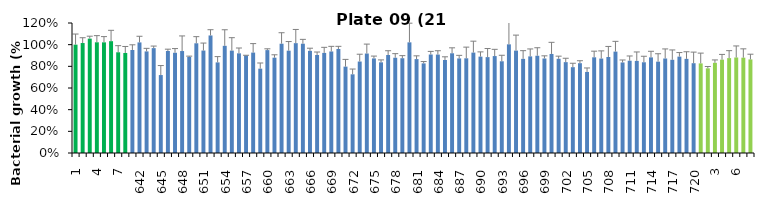
| Category | 21 h % |
|---|---|
| 1.0 | 1 |
| 2.0 | 1.015 |
| 3.0 | 1.056 |
| 4.0 | 1.022 |
| 5.0 | 1.021 |
| 6.0 | 1.032 |
| 7.0 | 0.93 |
| 8.0 | 0.923 |
| 641.0 | 0.951 |
| 642.0 | 1.021 |
| 643.0 | 0.938 |
| 644.0 | 0.968 |
| 645.0 | 0.72 |
| 646.0 | 0.942 |
| 647.0 | 0.925 |
| 648.0 | 0.941 |
| 649.0 | 0.886 |
| 650.0 | 1.013 |
| 651.0 | 0.946 |
| 652.0 | 1.085 |
| 653.0 | 0.836 |
| 654.0 | 0.989 |
| 655.0 | 0.945 |
| 656.0 | 0.92 |
| 657.0 | 0.901 |
| 658.0 | 0.927 |
| 659.0 | 0.779 |
| 660.0 | 0.95 |
| 661.0 | 0.88 |
| 662.0 | 1.009 |
| 663.0 | 0.945 |
| 664.0 | 1.014 |
| 665.0 | 1.009 |
| 666.0 | 0.943 |
| 667.0 | 0.905 |
| 668.0 | 0.924 |
| 669.0 | 0.937 |
| 670.0 | 0.96 |
| 671.0 | 0.797 |
| 672.0 | 0.726 |
| 673.0 | 0.844 |
| 674.0 | 0.918 |
| 675.0 | 0.873 |
| 676.0 | 0.837 |
| 677.0 | 0.905 |
| 678.0 | 0.879 |
| 679.0 | 0.875 |
| 680.0 | 1.021 |
| 681.0 | 0.867 |
| 682.0 | 0.827 |
| 683.0 | 0.909 |
| 684.0 | 0.909 |
| 685.0 | 0.859 |
| 686.0 | 0.921 |
| 687.0 | 0.873 |
| 688.0 | 0.874 |
| 689.0 | 0.927 |
| 690.0 | 0.89 |
| 691.0 | 0.885 |
| 692.0 | 0.895 |
| 693.0 | 0.847 |
| 694.0 | 1.003 |
| 695.0 | 0.945 |
| 696.0 | 0.869 |
| 697.0 | 0.892 |
| 698.0 | 0.898 |
| 699.0 | 0.872 |
| 700.0 | 0.914 |
| 701.0 | 0.87 |
| 702.0 | 0.839 |
| 703.0 | 0.792 |
| 704.0 | 0.829 |
| 705.0 | 0.748 |
| 706.0 | 0.883 |
| 707.0 | 0.872 |
| 708.0 | 0.886 |
| 709.0 | 0.936 |
| 710.0 | 0.836 |
| 711.0 | 0.852 |
| 712.0 | 0.85 |
| 713.0 | 0.838 |
| 714.0 | 0.883 |
| 715.0 | 0.843 |
| 716.0 | 0.872 |
| 717.0 | 0.86 |
| 718.0 | 0.89 |
| 719.0 | 0.869 |
| 720.0 | 0.829 |
| 1.0 | 0.827 |
| 2.0 | 0.781 |
| 3.0 | 0.832 |
| 4.0 | 0.862 |
| 5.0 | 0.876 |
| 6.0 | 0.882 |
| 7.0 | 0.88 |
| 8.0 | 0.864 |